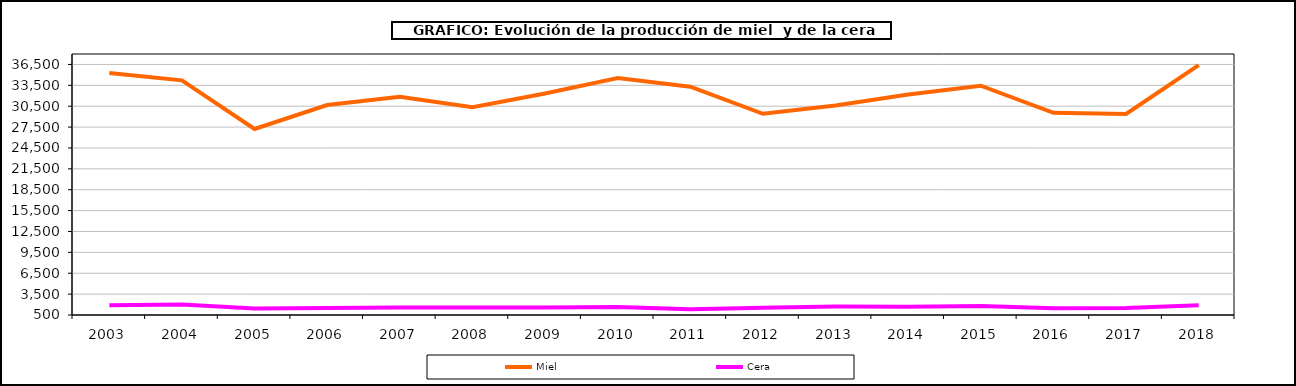
| Category | Miel | Cera |
|---|---|---|
| 2003.0 | 35278.604 | 1890.282 |
| 2004.0 | 34211.281 | 2012.912 |
| 2005.0 | 27229.804 | 1449.87 |
| 2006.0 | 30661.002 | 1522.368 |
| 2007.0 | 31840.043 | 1567.556 |
| 2008.0 | 30361.319 | 1574.535 |
| 2009.0 | 32336.448 | 1577.669 |
| 2010.0 | 34550 | 1649 |
| 2011.0 | 33298.2 | 1325.9 |
| 2012.0 | 29405 | 1533.9 |
| 2013.0 | 30612.761 | 1711.558 |
| 2014.0 | 32174.268 | 1688.302 |
| 2015.0 | 33440.771 | 1801.65 |
| 2016.0 | 29545.284 | 1472.699 |
| 2017.0 | 29393.153 | 1519.363 |
| 2018.0 | 36393.995 | 1903.773 |